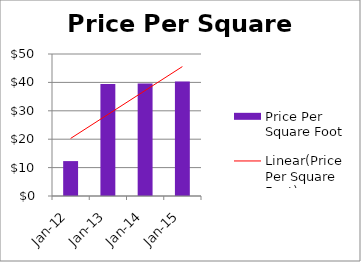
| Category | Price Per Square Foot |
|---|---|
| 2012-01-01 | 12.29 |
| 2013-01-01 | 39.43 |
| 2014-01-01 | 39.62 |
| 2015-01-01 | 40.34 |